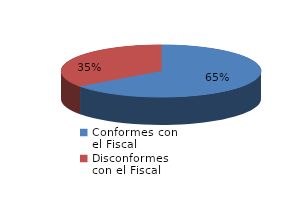
| Category | Series 0 |
|---|---|
| 0 | 5167 |
| 1 | 2789 |